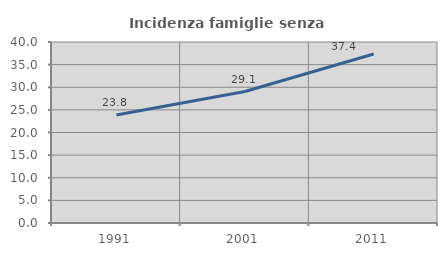
| Category | Incidenza famiglie senza nuclei |
|---|---|
| 1991.0 | 23.849 |
| 2001.0 | 29.058 |
| 2011.0 | 37.36 |